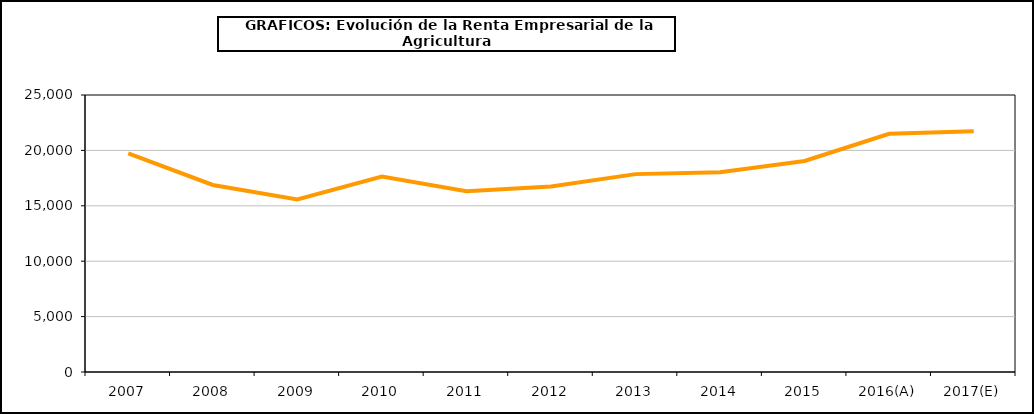
| Category | renta empresarial |
|---|---|
| 2007 | 19725.27 |
| 2008 | 16877.818 |
| 2009 | 15568.835 |
| 2010 | 17633.246 |
| 2011 | 16322.948 |
| 2012 | 16739.148 |
| 2013 | 17858.951 |
| 2014 | 18029.917 |
| 2015 | 19041.49 |
| 2016(A) | 21502.558 |
| 2017(E) | 21720.91 |